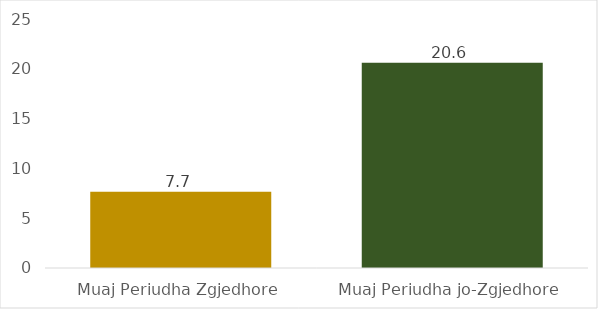
| Category | Mesatarisht Pagesa për Muaj |
|---|---|
| Muaj Periudha Zgjedhore | 7.651 |
| Muaj Periudha jo-Zgjedhore | 20.618 |